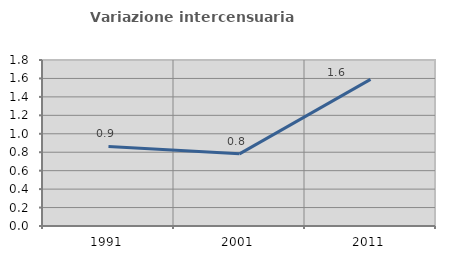
| Category | Variazione intercensuaria annua |
|---|---|
| 1991.0 | 0.863 |
| 2001.0 | 0.782 |
| 2011.0 | 1.589 |